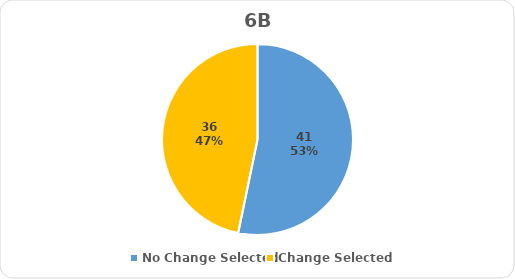
| Category | Series 0 |
|---|---|
| No Change Selected | 41 |
| Change Selected | 36 |